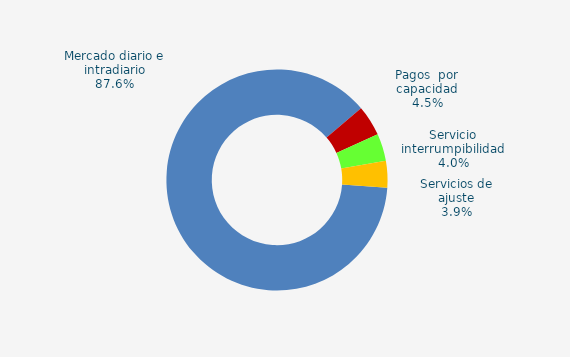
| Category | Series 0 |
|---|---|
| Mercado diario e intradiario | 47.6 |
| Pagos  por capacidad | 2.43 |
| Servicio interrumpibilidad | 2.17 |
| Servicios de ajuste | 2.12 |